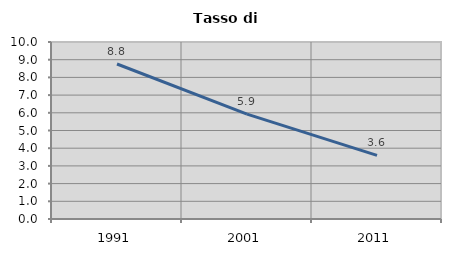
| Category | Tasso di disoccupazione   |
|---|---|
| 1991.0 | 8.756 |
| 2001.0 | 5.929 |
| 2011.0 | 3.595 |